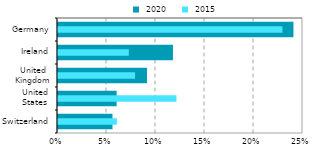
| Category |  2020 |
|---|---|
| Switzerland | 0.056 |
| United
States | 0.06 |
| United
Kingdom | 0.091 |
| Ireland | 0.117 |
| Germany | 0.24 |